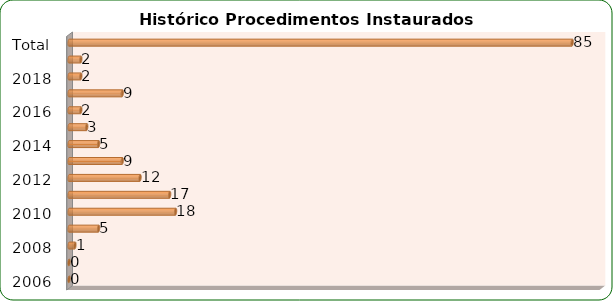
| Category | Total de Sindicâncias  |
|---|---|
| 2006 | 0 |
| 2007 | 0 |
| 2008 | 1 |
| 2009 | 5 |
| 2010 | 18 |
| 2011 | 17 |
| 2012 | 12 |
| 2013 | 9 |
| 2014 | 5 |
| 2015 | 3 |
| 2016 | 2 |
| 2017 | 9 |
| 2018 | 2 |
| 2019 | 2 |
| Total | 85 |